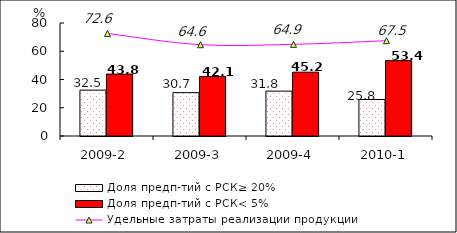
| Category | Доля предп-тий с РСК≥ 20% | Доля предп-тий с РСК< 5% |
|---|---|---|
| 2009-2 | 32.473 | 43.827 |
| 2009-3 | 30.697 | 42.088 |
| 2009-4 | 31.779 | 45.172 |
| 2010-1 | 25.83 | 53.358 |